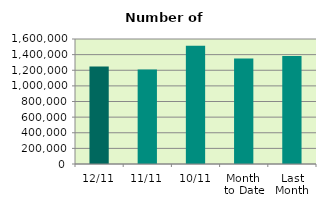
| Category | Series 0 |
|---|---|
| 12/11 | 1248346 |
| 11/11 | 1210680 |
| 10/11 | 1513386 |
| Month 
to Date | 1349917.2 |
| Last
Month | 1383348.571 |